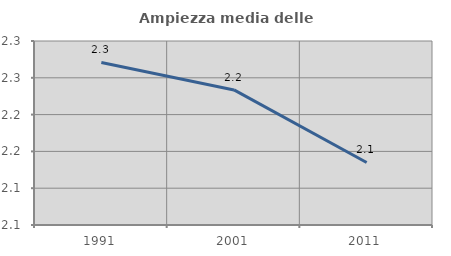
| Category | Ampiezza media delle famiglie |
|---|---|
| 1991.0 | 2.271 |
| 2001.0 | 2.234 |
| 2011.0 | 2.135 |